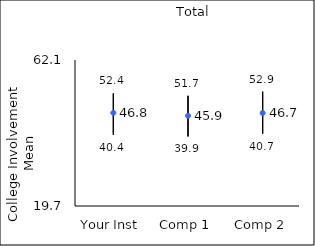
| Category | 25th percentile | 75th percentile | Mean |
|---|---|---|---|
| Your Inst | 40.4 | 52.4 | 46.76 |
| Comp 1 | 39.9 | 51.7 | 45.9 |
| Comp 2 | 40.7 | 52.9 | 46.71 |